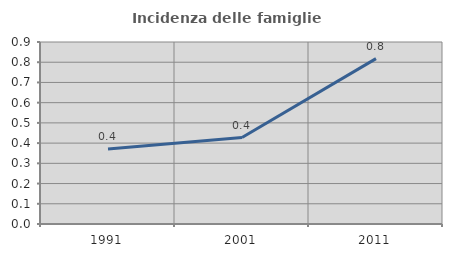
| Category | Incidenza delle famiglie numerose |
|---|---|
| 1991.0 | 0.371 |
| 2001.0 | 0.427 |
| 2011.0 | 0.818 |